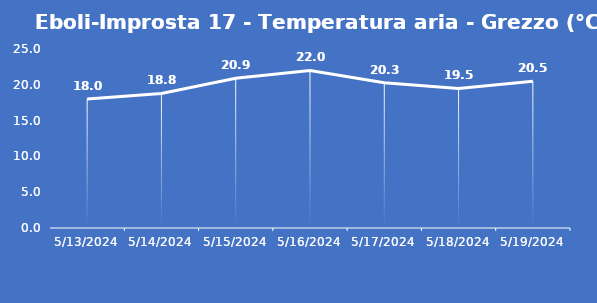
| Category | Eboli-Improsta 17 - Temperatura aria - Grezzo (°C) |
|---|---|
| 5/13/24 | 18 |
| 5/14/24 | 18.8 |
| 5/15/24 | 20.9 |
| 5/16/24 | 22 |
| 5/17/24 | 20.3 |
| 5/18/24 | 19.5 |
| 5/19/24 | 20.5 |